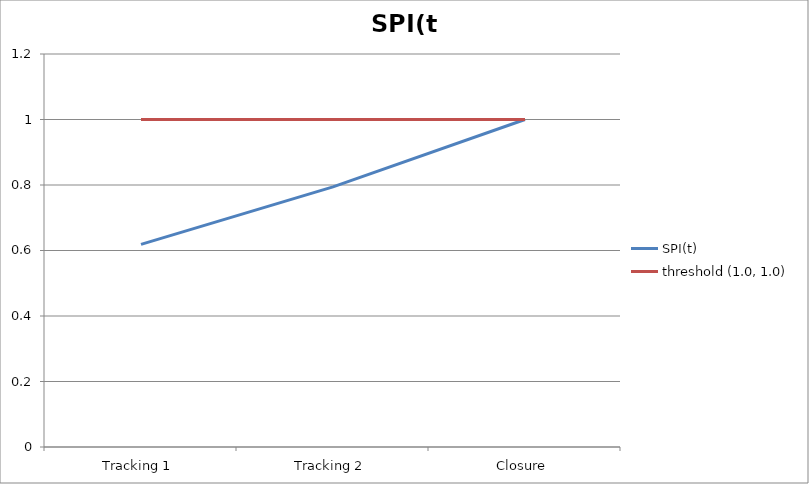
| Category | SPI(t) | threshold (1.0, 1.0) |
|---|---|---|
| Tracking 1 | 0.619 | 1 |
| Tracking 2 | 0.794 | 1 |
| Closure | 1 | 1 |